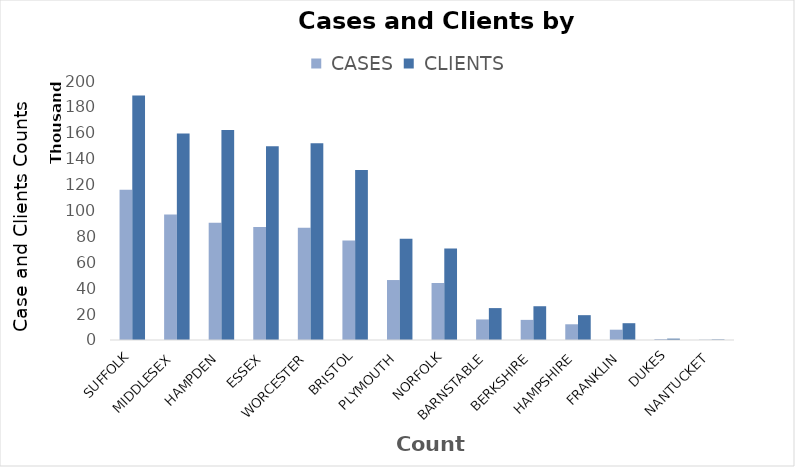
| Category |  CASES |  CLIENTS |
|---|---|---|
| SUFFOLK | 115957 | 188783 |
| MIDDLESEX | 96874 | 159513 |
| HAMPDEN | 90532 | 162230 |
| ESSEX | 87353 | 149618 |
| WORCESTER | 86663 | 151947 |
| BRISTOL | 76892 | 131249 |
| PLYMOUTH | 46307 | 78193 |
| NORFOLK | 44022 | 70714 |
| BARNSTABLE | 15871 | 24638 |
| BERKSHIRE | 15542 | 26074 |
| HAMPSHIRE | 12138 | 19179 |
| FRANKLIN | 7955 | 12972 |
| DUKES | 705 | 1050 |
| NANTUCKET | 231 | 402 |